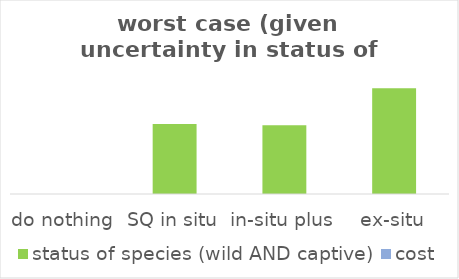
| Category | status of species (wild AND captive) | cost |
|---|---|---|
| do nothing | 0 | 0 |
| SQ in situ | 0.287 | 0 |
| in-situ plus | 0.281 | 0 |
| ex-situ | 0.433 | 0 |